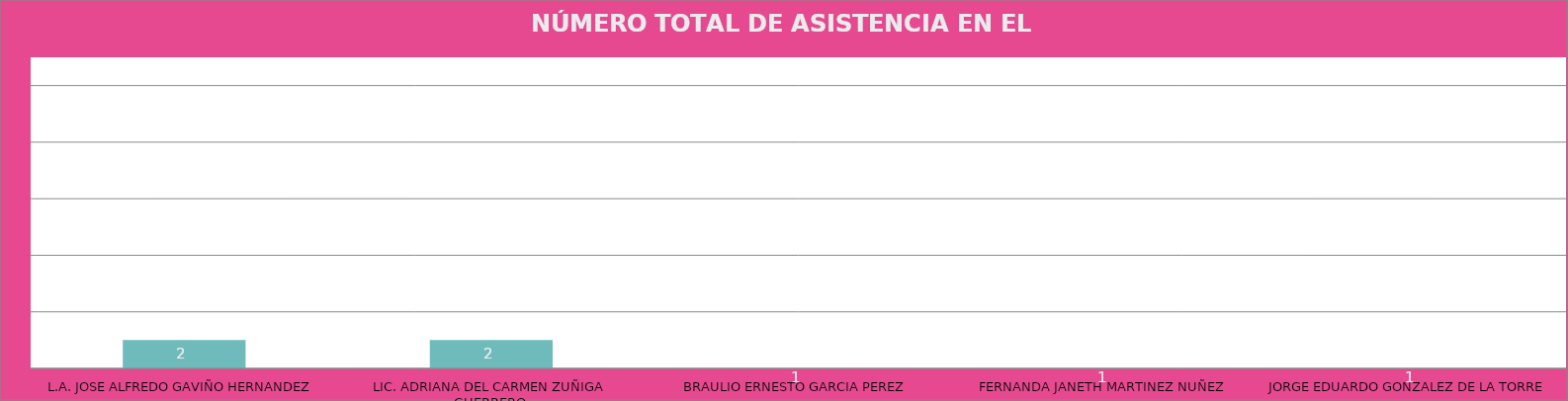
| Category | L.A. JOSE ALFREDO GAVIÑO HERNANDEZ |
|---|---|
| L.A. JOSE ALFREDO GAVIÑO HERNANDEZ | 2 |
| LIC. ADRIANA DEL CARMEN ZUÑIGA GUERRERO | 2 |
| BRAULIO ERNESTO GARCIA PEREZ | 1 |
| FERNANDA JANETH MARTINEZ NUÑEZ | 1 |
| JORGE EDUARDO GONZALEZ DE LA TORRE | 1 |